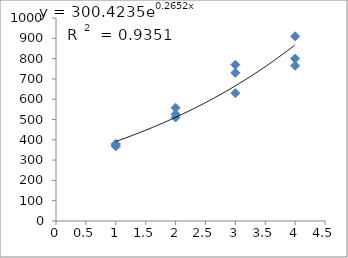
| Category | Series 0 |
|---|---|
| 1.0 | 380 |
| 1.0 | 368 |
| 1.0 | 374 |
| 2.0 | 558 |
| 2.0 | 526 |
| 2.0 | 510 |
| 3.0 | 770 |
| 3.0 | 730 |
| 3.0 | 630 |
| 4.0 | 765 |
| 4.0 | 800 |
| 4.0 | 910 |